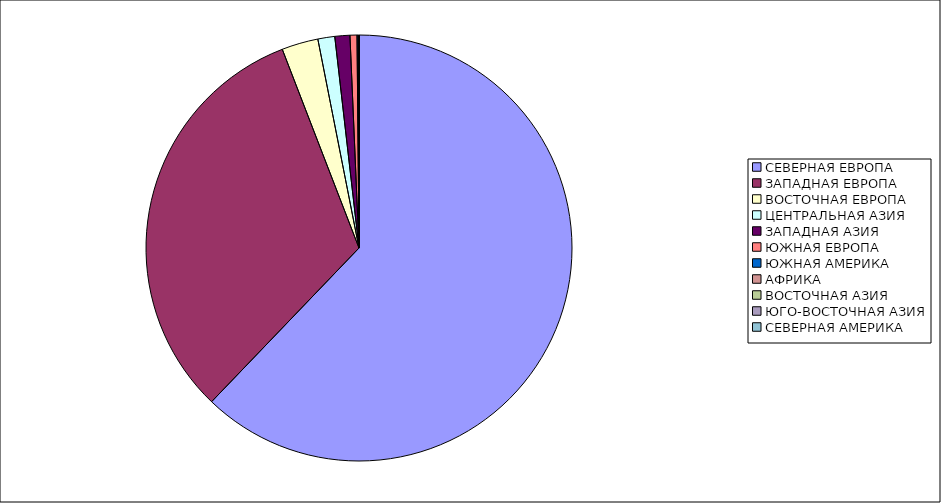
| Category | Оборот |
|---|---|
| СЕВЕРНАЯ ЕВРОПА | 62.166 |
| ЗАПАДНАЯ ЕВРОПА | 31.969 |
| ВОСТОЧНАЯ ЕВРОПА | 2.768 |
| ЦЕНТРАЛЬНАЯ АЗИЯ | 1.279 |
| ЗАПАДНАЯ АЗИЯ | 1.14 |
| ЮЖНАЯ ЕВРОПА | 0.531 |
| ЮЖНАЯ АМЕРИКА | 0.087 |
| АФРИКА | 0.055 |
| ВОСТОЧНАЯ АЗИЯ | 0.005 |
| ЮГО-ВОСТОЧНАЯ АЗИЯ | 0 |
| СЕВЕРНАЯ АМЕРИКА | 0 |